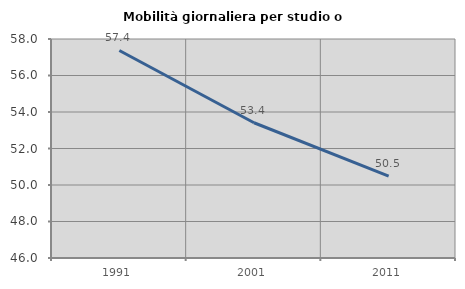
| Category | Mobilità giornaliera per studio o lavoro |
|---|---|
| 1991.0 | 57.371 |
| 2001.0 | 53.412 |
| 2011.0 | 50.484 |